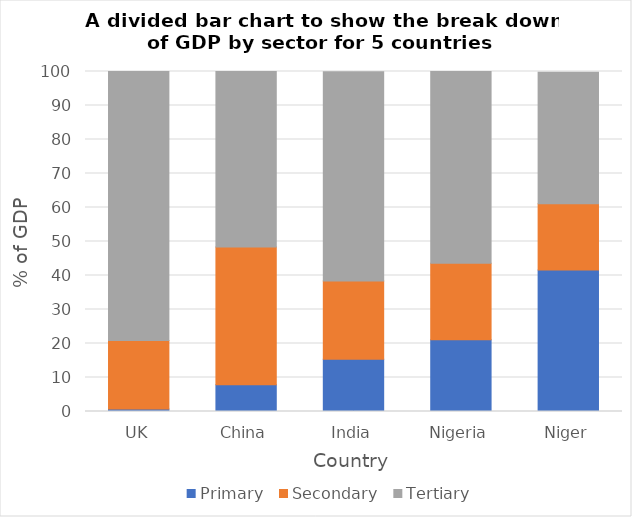
| Category | Primary  | Secondary  | Tertiary |
|---|---|---|---|
| UK | 0.7 | 20.2 | 79.2 |
| China | 7.9 | 40.5 | 51.6 |
| India | 15.4 | 23 | 61.5 |
| Nigeria | 21.1 | 22.5 | 56.4 |
| Niger | 41.6 | 19.5 | 38.7 |